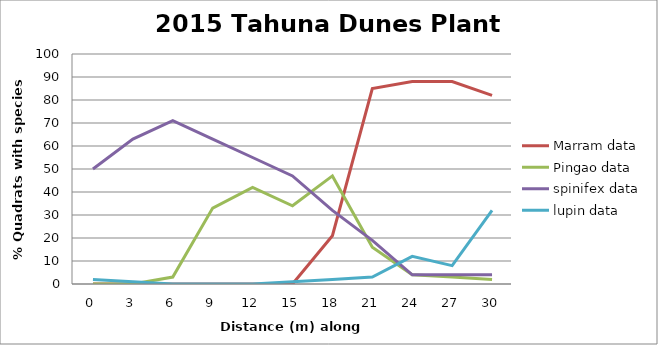
| Category | Marram data | Pingao data | spinifex data | lupin data |
|---|---|---|---|---|
| 0.0 | 0 | 0 | 50 | 2 |
| 3.0 | 0 | 0 | 63 | 1 |
| 6.0 | 0 | 3 | 71 | 0 |
| 9.0 | 0 | 33 | 63 | 0 |
| 12.0 | 0 | 42 | 55 | 0 |
| 15.0 | 0 | 34 | 47 | 1 |
| 18.0 | 21 | 47 | 32 | 2 |
| 21.0 | 85 | 16 | 19 | 3 |
| 24.0 | 88 | 4 | 4 | 12 |
| 27.0 | 88 | 3 | 4 | 8 |
| 30.0 | 82 | 2 | 4 | 32 |